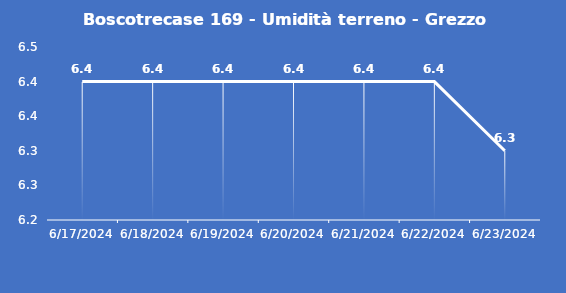
| Category | Boscotrecase 169 - Umidità terreno - Grezzo (%VWC) |
|---|---|
| 6/17/24 | 6.4 |
| 6/18/24 | 6.4 |
| 6/19/24 | 6.4 |
| 6/20/24 | 6.4 |
| 6/21/24 | 6.4 |
| 6/22/24 | 6.4 |
| 6/23/24 | 6.3 |